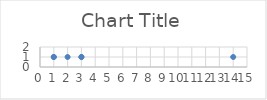
| Category | Series 0 |
|---|---|
| 1.0 | 1 |
| 1.0 | 1 |
| 2.0 | 1 |
| 3.0 | 1 |
| 3.0 | 1 |
| 14.0 | 1 |